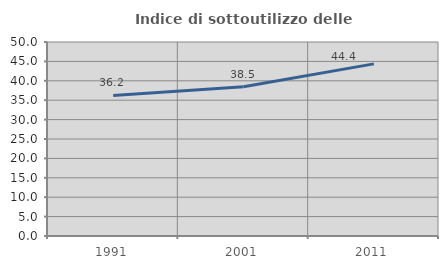
| Category | Indice di sottoutilizzo delle abitazioni  |
|---|---|
| 1991.0 | 36.221 |
| 2001.0 | 38.456 |
| 2011.0 | 44.362 |